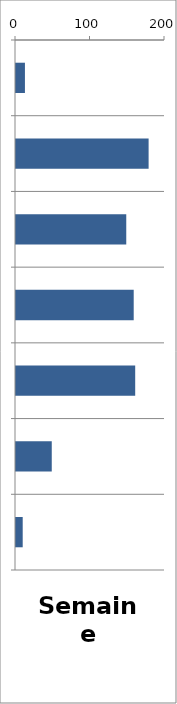
| Category | PL |
|---|---|
| 0 | 12 |
| 1 | 178 |
| 2 | 148 |
| 3 | 158 |
| 4 | 160 |
| 5 | 48 |
| 6 | 9 |